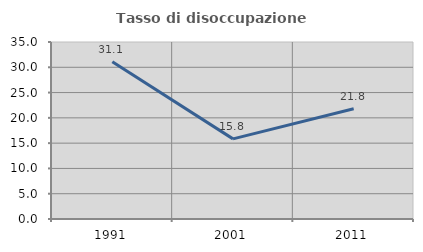
| Category | Tasso di disoccupazione giovanile  |
|---|---|
| 1991.0 | 31.089 |
| 2001.0 | 15.842 |
| 2011.0 | 21.795 |